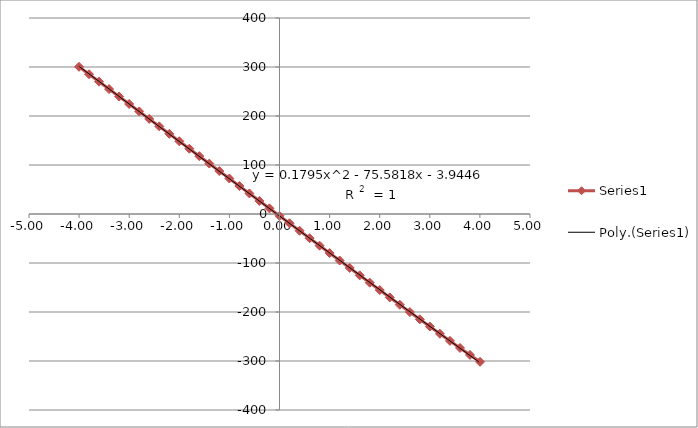
| Category | Series 1 |
|---|---|
| 4.00246 | -301.6 |
| 3.80215 | -287.65 |
| 3.60249 | -273.39 |
| 3.40217 | -258.89 |
| 3.20189 | -244.34 |
| 3.0021199999999997 | -229.67 |
| 2.8017 | -214.93 |
| 2.6014500000000003 | -200.11 |
| 2.40149 | -185.19 |
| 2.2017800000000003 | -170.23 |
| 2.0015 | -155.26 |
| 1.80113 | -140.24 |
| 1.6012399999999998 | -125.19 |
| 1.4009 | -110.05 |
| 1.20086 | -94.94 |
| 1.00076 | -79.78 |
| 0.8006000000000001 | -64.58 |
| 0.60033 | -49.35 |
| 0.40059999999999996 | -34.18 |
| 0.2002 | -18.94 |
| -0.0002 | -3.71 |
| -0.19998 | 11.48 |
| -0.40013 | 26.69 |
| -0.60063 | 41.97 |
| -0.80032 | 57.13 |
| -1.00063 | 72.39 |
| -1.20105 | 87.66 |
| -1.40069 | 102.88 |
| -1.60076 | 118.01 |
| -1.80041 | 133.25 |
| -1.99952 | 148.4 |
| -2.19918 | 163.61 |
| -2.3996500000000003 | 178.84 |
| -2.6001200000000004 | 193.96 |
| -2.8004499999999997 | 209.32 |
| -3.00101 | 224.54 |
| -3.20141 | 239.75 |
| -3.40111 | 254.9 |
| -3.6017 | 270.07 |
| -3.8016499999999995 | 285.26 |
| -4.0015 | 300.45 |